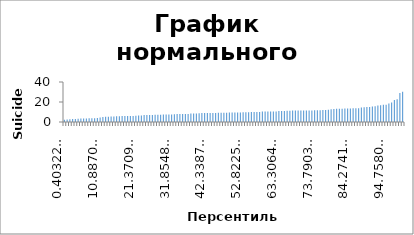
| Category | Series 0 |
|---|---|
| 0.4032258064516129 | 2.2 |
| 1.2096774193548385 | 2.6 |
| 2.0161290322580645 | 2.7 |
| 2.82258064516129 | 2.9 |
| 3.629032258064516 | 3.1 |
| 4.435483870967742 | 3.2 |
| 5.241935483870967 | 3.4 |
| 6.048387096774193 | 3.4 |
| 6.854838709677419 | 3.5 |
| 7.661290322580645 | 3.7 |
| 8.46774193548387 | 3.7 |
| 9.274193548387096 | 3.8 |
| 10.08064516129032 | 4 |
| 10.887096774193546 | 4.4 |
| 11.693548387096772 | 5.1 |
| 12.499999999999998 | 5.2 |
| 13.306451612903224 | 5.2 |
| 14.11290322580645 | 5.4 |
| 14.919354838709676 | 5.5 |
| 15.725806451612902 | 5.7 |
| 16.532258064516128 | 5.8 |
| 17.338709677419352 | 5.9 |
| 18.14516129032258 | 5.9 |
| 18.951612903225804 | 5.9 |
| 19.75806451612903 | 6.1 |
| 20.564516129032256 | 6.1 |
| 21.37096774193548 | 6.2 |
| 22.177419354838708 | 6.4 |
| 22.983870967741932 | 6.5 |
| 23.79032258064516 | 6.9 |
| 24.596774193548384 | 7 |
| 25.403225806451612 | 7 |
| 26.209677419354836 | 7 |
| 27.01612903225806 | 7.2 |
| 27.82258064516129 | 7.2 |
| 28.629032258064512 | 7.3 |
| 29.43548387096774 | 7.4 |
| 30.241935483870964 | 7.4 |
| 31.048387096774192 | 7.5 |
| 31.854838709677416 | 7.6 |
| 32.66129032258065 | 7.8 |
| 33.46774193548387 | 7.9 |
| 34.274193548387096 | 7.9 |
| 35.08064516129032 | 8 |
| 35.88709677419355 | 8 |
| 36.693548387096776 | 8.1 |
| 37.5 | 8.4 |
| 38.306451612903224 | 8.5 |
| 39.11290322580645 | 8.6 |
| 39.91935483870968 | 8.7 |
| 40.725806451612904 | 8.9 |
| 41.53225806451613 | 8.9 |
| 42.33870967741935 | 9 |
| 43.145161290322584 | 9.1 |
| 43.95161290322581 | 9.1 |
| 44.75806451612903 | 9.1 |
| 45.564516129032256 | 9.2 |
| 46.37096774193548 | 9.3 |
| 47.17741935483871 | 9.3 |
| 47.983870967741936 | 9.3 |
| 48.79032258064516 | 9.5 |
| 49.596774193548384 | 9.6 |
| 50.403225806451616 | 9.6 |
| 51.20967741935484 | 9.6 |
| 52.016129032258064 | 9.6 |
| 52.82258064516129 | 9.7 |
| 53.62903225806451 | 9.7 |
| 54.435483870967744 | 9.8 |
| 55.24193548387097 | 10 |
| 56.04838709677419 | 10.1 |
| 56.854838709677416 | 10.1 |
| 57.66129032258065 | 10.1 |
| 58.46774193548387 | 10.4 |
| 59.274193548387096 | 10.4 |
| 60.08064516129032 | 10.5 |
| 60.887096774193544 | 10.5 |
| 61.693548387096776 | 10.5 |
| 62.5 | 10.6 |
| 63.306451612903224 | 10.9 |
| 64.11290322580645 | 10.9 |
| 64.91935483870968 | 11.1 |
| 65.7258064516129 | 11.3 |
| 66.53225806451613 | 11.3 |
| 67.33870967741936 | 11.4 |
| 68.14516129032258 | 11.4 |
| 68.95161290322581 | 11.5 |
| 69.75806451612902 | 11.5 |
| 70.56451612903226 | 11.5 |
| 71.37096774193549 | 11.6 |
| 72.1774193548387 | 11.6 |
| 72.98387096774194 | 11.6 |
| 73.79032258064515 | 11.7 |
| 74.59677419354838 | 11.7 |
| 75.40322580645162 | 11.8 |
| 76.20967741935483 | 11.9 |
| 77.01612903225806 | 12.1 |
| 77.82258064516128 | 12.2 |
| 78.62903225806451 | 12.8 |
| 79.43548387096774 | 12.9 |
| 80.24193548387096 | 13.3 |
| 81.04838709677419 | 13.3 |
| 81.85483870967742 | 13.3 |
| 82.66129032258064 | 13.4 |
| 83.46774193548387 | 13.5 |
| 84.27419354838709 | 13.6 |
| 85.08064516129032 | 13.7 |
| 85.88709677419355 | 13.8 |
| 86.69354838709677 | 13.8 |
| 87.5 | 14.4 |
| 88.30645161290322 | 14.8 |
| 89.11290322580645 | 15 |
| 89.91935483870968 | 15.1 |
| 90.7258064516129 | 15.4 |
| 91.53225806451613 | 15.7 |
| 92.33870967741935 | 16.5 |
| 93.14516129032258 | 16.7 |
| 93.95161290322581 | 17.2 |
| 94.75806451612902 | 17.3 |
| 95.56451612903226 | 18.5 |
| 96.37096774193549 | 19.5 |
| 97.1774193548387 | 22 |
| 97.98387096774194 | 22.8 |
| 98.79032258064515 | 28.9 |
| 99.59677419354838 | 30.2 |